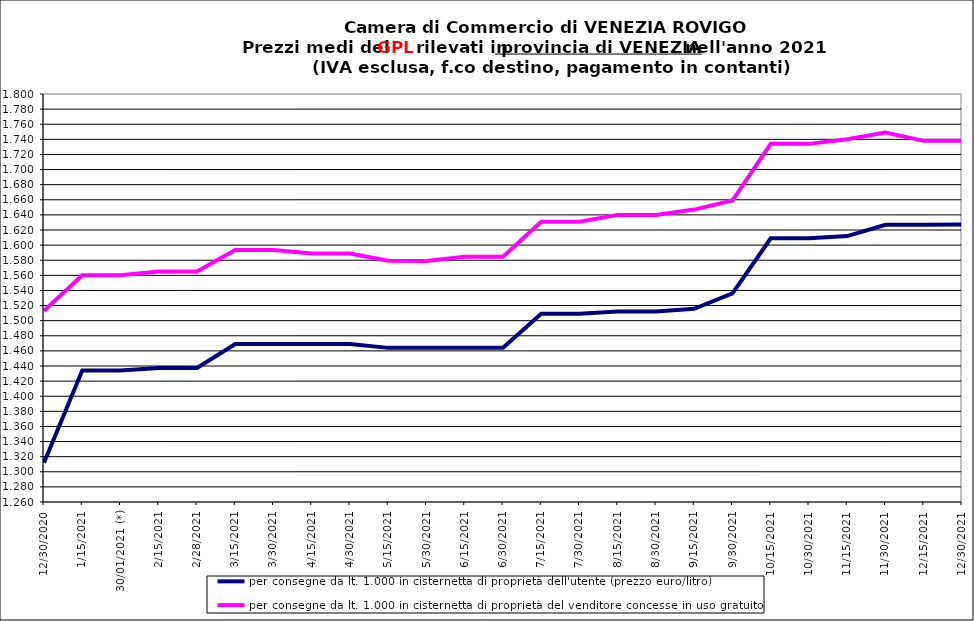
| Category | per consegne da lt. 1.000 in cisternetta di proprietà dell'utente (prezzo euro/litro) | per consegne da lt. 1.000 in cisternetta di proprietà del venditore concesse in uso gratuito (prezzo euro/litro) |
|---|---|---|
| 30/12/2020 | 1.312 | 1.513 |
| 15/01/2021 | 1.434 | 1.56 |
| 30/01/2021 (*) | 1.434 | 1.56 |
| 15/02/2021 | 1.437 | 1.565 |
| 28/02/2021 | 1.437 | 1.565 |
| 15/03/2021 | 1.469 | 1.594 |
| 30/03/2021 | 1.469 | 1.594 |
| 15/04/2021 | 1.469 | 1.589 |
| 30/04/2021 | 1.469 | 1.589 |
| 15/05/2021 | 1.464 | 1.579 |
| 30/05/2021 | 1.464 | 1.579 |
| 15/06/2021 | 1.464 | 1.585 |
| 30/06/2021 | 1.464 | 1.585 |
| 15/07/2021 | 1.509 | 1.631 |
| 30/07/2021 | 1.509 | 1.631 |
| 15/08/2021 | 1.512 | 1.64 |
| 30/08/2021 | 1.512 | 1.64 |
| 15/09/2021 | 1.516 | 1.647 |
| 30/09/2021 | 1.536 | 1.659 |
| 15/10/2021 | 1.609 | 1.734 |
| 30/10/2021 | 1.609 | 1.734 |
| 15/11/2021 | 1.612 | 1.74 |
| 30/11/2021 | 1.627 | 1.749 |
| 15/12/2021 | 1.627 | 1.738 |
| 30/12/2021 | 1.627 | 1.738 |